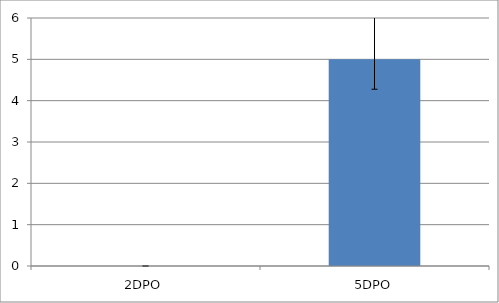
| Category | Series 0 |
|---|---|
| 2DPO | 0 |
| 5DPO | 5.002 |